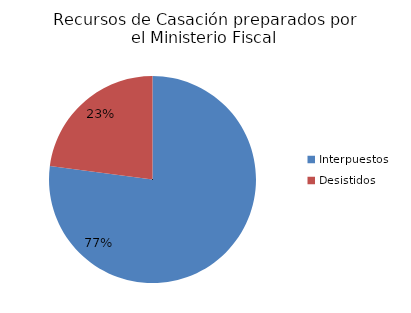
| Category | Series 0 |
|---|---|
| Interpuestos | 74 |
| Desistidos | 22 |